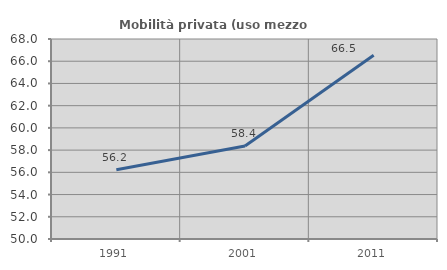
| Category | Mobilità privata (uso mezzo privato) |
|---|---|
| 1991.0 | 56.224 |
| 2001.0 | 58.365 |
| 2011.0 | 66.543 |